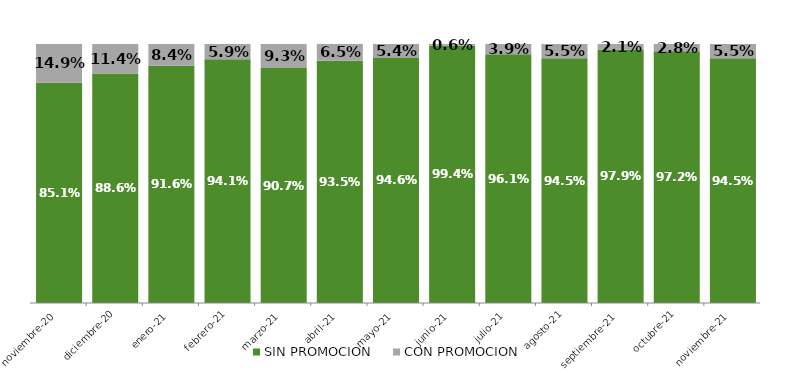
| Category | SIN PROMOCION   | CON PROMOCION   |
|---|---|---|
| 2020-11-01 | 0.851 | 0.149 |
| 2020-12-01 | 0.886 | 0.114 |
| 2021-01-01 | 0.916 | 0.084 |
| 2021-02-01 | 0.941 | 0.059 |
| 2021-03-01 | 0.907 | 0.093 |
| 2021-04-01 | 0.935 | 0.065 |
| 2021-05-01 | 0.946 | 0.054 |
| 2021-06-01 | 0.994 | 0.006 |
| 2021-07-01 | 0.961 | 0.039 |
| 2021-08-01 | 0.945 | 0.055 |
| 2021-09-01 | 0.979 | 0.021 |
| 2021-10-01 | 0.972 | 0.028 |
| 2021-11-01 | 0.945 | 0.055 |